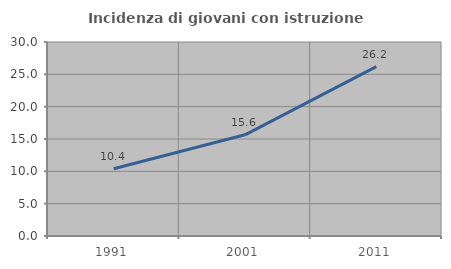
| Category | Incidenza di giovani con istruzione universitaria |
|---|---|
| 1991.0 | 10.405 |
| 2001.0 | 15.647 |
| 2011.0 | 26.185 |